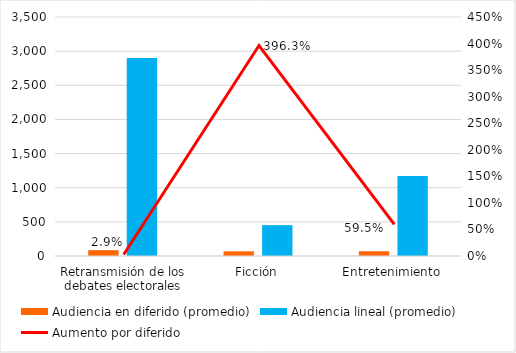
| Category | Audiencia en diferido (promedio) | Audiencia lineal (promedio) |
|---|---|---|
| Retransmisión de los debates electorales | 85.03 | 2898.88 |
| Ficción | 68.96 | 452 |
| Entretenimiento | 70.08 | 1172.6 |